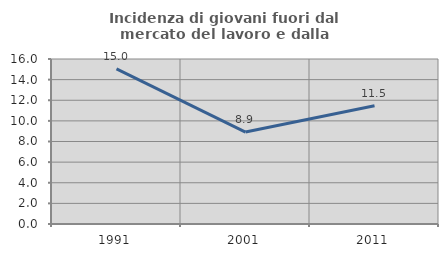
| Category | Incidenza di giovani fuori dal mercato del lavoro e dalla formazione  |
|---|---|
| 1991.0 | 15.047 |
| 2001.0 | 8.917 |
| 2011.0 | 11.475 |